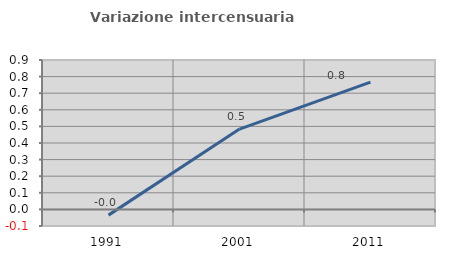
| Category | Variazione intercensuaria annua |
|---|---|
| 1991.0 | -0.035 |
| 2001.0 | 0.484 |
| 2011.0 | 0.766 |